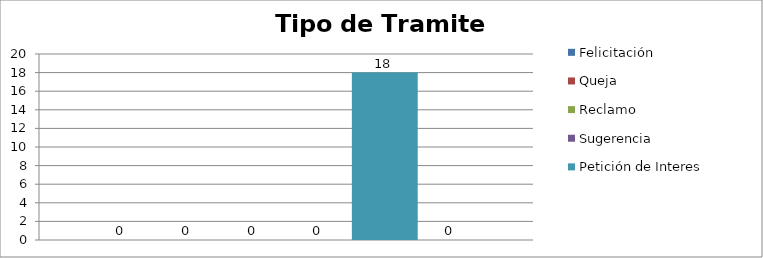
| Category | Felicitación | Queja | Reclamo | Sugerencia | Petición de Interes General | Petición de Interes Particular |
|---|---|---|---|---|---|---|
| 0 | 0 | 0 | 0 | 0 | 18 | 0 |